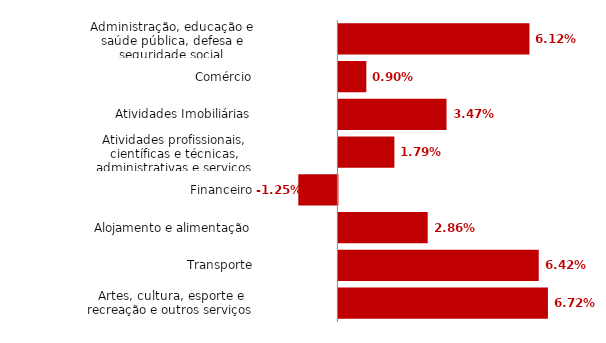
| Category | Series 0 |
|---|---|
| Administração, educação e saúde pública, defesa e seguridade social | 0.061 |
| Comércio | 0.009 |
| Atividades Imobiliárias | 0.035 |
| Atividades profissionais, científicas e técnicas, administrativas e serviços complementares | 0.018 |
| Financeiro | -0.013 |
| Alojamento e alimentação | 0.029 |
| Transporte | 0.064 |
| Artes, cultura, esporte e recreação e outros serviços | 0.067 |